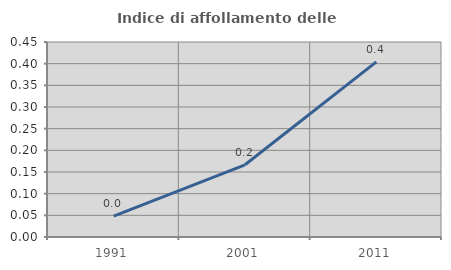
| Category | Indice di affollamento delle abitazioni  |
|---|---|
| 1991.0 | 0.048 |
| 2001.0 | 0.167 |
| 2011.0 | 0.404 |